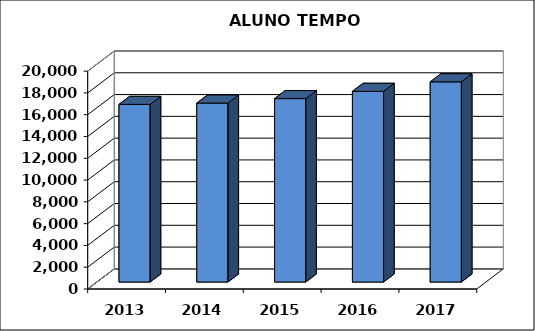
| Category | Series 0 |
|---|---|
| 2013.0 | 16310.11 |
| 2014.0 | 16430.531 |
| 2015.0 | 16838.848 |
| 2016.0 | 17507.14 |
| 2017.0 | 18378.013 |